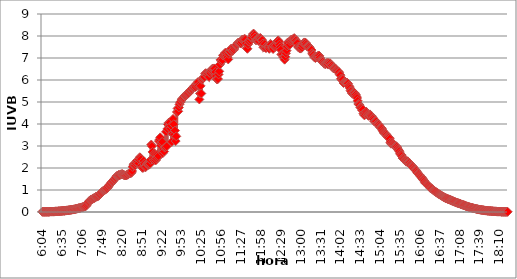
| Category | Series 0 |
|---|---|
| 0.25277777777777777 | 0.009 |
| 0.2534722222222222 | 0.009 |
| 0.25416666666666665 | 0.009 |
| 0.2548611111111111 | 0.009 |
| 0.2555555555555556 | 0.009 |
| 0.25625000000000003 | 0.009 |
| 0.2569444444444445 | 0.009 |
| 0.2576388888888889 | 0.009 |
| 0.25833333333333336 | 0.009 |
| 0.2590277777777778 | 0.009 |
| 0.25972222222222224 | 0.009 |
| 0.2604166666666667 | 0.009 |
| 0.2611111111111111 | 0.019 |
| 0.26180555555555557 | 0.019 |
| 0.2625 | 0.019 |
| 0.26319444444444445 | 0.019 |
| 0.2638888888888889 | 0.019 |
| 0.26458333333333334 | 0.019 |
| 0.2652777777777778 | 0.019 |
| 0.2659722222222222 | 0.019 |
| 0.26666666666666666 | 0.028 |
| 0.2673611111111111 | 0.028 |
| 0.26805555555555555 | 0.028 |
| 0.26875 | 0.028 |
| 0.26944444444444443 | 0.028 |
| 0.2701388888888889 | 0.037 |
| 0.2708333333333333 | 0.037 |
| 0.27152777777777776 | 0.037 |
| 0.2722222222222222 | 0.037 |
| 0.27291666666666664 | 0.047 |
| 0.2736111111111111 | 0.047 |
| 0.2743055555555555 | 0.047 |
| 0.27499999999999997 | 0.056 |
| 0.27569444444444446 | 0.056 |
| 0.27638888888888885 | 0.056 |
| 0.27708333333333335 | 0.056 |
| 0.2777777777777778 | 0.065 |
| 0.27847222222222223 | 0.065 |
| 0.2791666666666667 | 0.075 |
| 0.2798611111111111 | 0.075 |
| 0.28055555555555556 | 0.075 |
| 0.28125 | 0.084 |
| 0.28194444444444444 | 0.084 |
| 0.2826388888888889 | 0.093 |
| 0.2833333333333333 | 0.093 |
| 0.28402777777777777 | 0.103 |
| 0.2847222222222222 | 0.103 |
| 0.28541666666666665 | 0.112 |
| 0.28611111111111115 | 0.112 |
| 0.28680555555555554 | 0.121 |
| 0.28750000000000003 | 0.121 |
| 0.2881944444444445 | 0.13 |
| 0.2888888888888889 | 0.14 |
| 0.28958333333333336 | 0.149 |
| 0.2902777777777778 | 0.149 |
| 0.29097222222222224 | 0.158 |
| 0.2916666666666667 | 0.168 |
| 0.2923611111111111 | 0.177 |
| 0.29305555555555557 | 0.177 |
| 0.29375 | 0.186 |
| 0.29444444444444445 | 0.196 |
| 0.2951388888888889 | 0.205 |
| 0.29583333333333334 | 0.214 |
| 0.2965277777777778 | 0.224 |
| 0.2972222222222222 | 0.233 |
| 0.29791666666666666 | 0.242 |
| 0.2986111111111111 | 0.252 |
| 0.29930555555555555 | 0.261 |
| 0.3 | 0.27 |
| 0.30277777777777776 | 0.308 |
| 0.3055555555555555 | 0.363 |
| 0.30833333333333335 | 0.419 |
| 0.30972222222222223 | 0.447 |
| 0.3111111111111111 | 0.485 |
| 0.3125 | 0.522 |
| 0.31319444444444444 | 0.541 |
| 0.3138888888888889 | 0.559 |
| 0.3145833333333333 | 0.569 |
| 0.31527777777777777 | 0.587 |
| 0.3159722222222222 | 0.606 |
| 0.31666666666666665 | 0.624 |
| 0.31736111111111115 | 0.634 |
| 0.31805555555555554 | 0.652 |
| 0.31875000000000003 | 0.68 |
| 0.3194444444444445 | 0.69 |
| 0.3201388888888889 | 0.699 |
| 0.32083333333333336 | 0.708 |
| 0.3215277777777778 | 0.727 |
| 0.32222222222222224 | 0.746 |
| 0.3229166666666667 | 0.774 |
| 0.3236111111111111 | 0.802 |
| 0.32430555555555557 | 0.839 |
| 0.325 | 0.867 |
| 0.32569444444444445 | 0.904 |
| 0.3263888888888889 | 0.932 |
| 0.32708333333333334 | 0.96 |
| 0.3277777777777778 | 0.979 |
| 0.3284722222222222 | 0.997 |
| 0.32916666666666666 | 1.016 |
| 0.3298611111111111 | 1.044 |
| 0.33055555555555555 | 1.053 |
| 0.33125 | 1.072 |
| 0.33194444444444443 | 1.109 |
| 0.3326388888888889 | 1.156 |
| 0.3333333333333333 | 1.202 |
| 0.3340277777777778 | 1.24 |
| 0.3347222222222222 | 1.268 |
| 0.3354166666666667 | 1.305 |
| 0.3361111111111111 | 1.342 |
| 0.3368055555555556 | 1.379 |
| 0.33749999999999997 | 1.407 |
| 0.33819444444444446 | 1.435 |
| 0.33888888888888885 | 1.473 |
| 0.33958333333333335 | 1.51 |
| 0.34027777777777773 | 1.547 |
| 0.34097222222222223 | 1.584 |
| 0.3416666666666666 | 1.631 |
| 0.3423611111111111 | 1.64 |
| 0.3430555555555555 | 1.659 |
| 0.34375 | 1.687 |
| 0.3444444444444445 | 1.659 |
| 0.3451388888888889 | 1.678 |
| 0.3458333333333334 | 1.706 |
| 0.34652777777777777 | 1.715 |
| 0.34722222222222227 | 1.715 |
| 0.34791666666666665 | 1.724 |
| 0.34861111111111115 | 1.706 |
| 0.34930555555555554 | 1.687 |
| 0.35000000000000003 | 1.668 |
| 0.3506944444444444 | 1.659 |
| 0.3513888888888889 | 1.659 |
| 0.3520833333333333 | 1.668 |
| 0.3527777777777778 | 1.687 |
| 0.3534722222222222 | 1.696 |
| 0.3541666666666667 | 1.734 |
| 0.3548611111111111 | 1.743 |
| 0.35555555555555557 | 1.752 |
| 0.35625 | 1.78 |
| 0.35694444444444445 | 1.761 |
| 0.3576388888888889 | 1.789 |
| 0.35833333333333334 | 1.864 |
| 0.3590277777777778 | 2.05 |
| 0.3597222222222222 | 2.134 |
| 0.36041666666666666 | 2.181 |
| 0.3611111111111111 | 2.2 |
| 0.36180555555555555 | 2.116 |
| 0.3625 | 2.2 |
| 0.36319444444444443 | 2.265 |
| 0.3638888888888889 | 2.339 |
| 0.3645833333333333 | 2.283 |
| 0.3652777777777778 | 2.209 |
| 0.3659722222222222 | 2.386 |
| 0.3666666666666667 | 2.488 |
| 0.3673611111111111 | 2.47 |
| 0.3680555555555556 | 2.405 |
| 0.36874999999999997 | 2.106 |
| 0.36944444444444446 | 2.013 |
| 0.37013888888888885 | 2.004 |
| 0.37083333333333335 | 2.321 |
| 0.37152777777777773 | 2.19 |
| 0.37222222222222223 | 2.06 |
| 0.3729166666666666 | 2.032 |
| 0.3736111111111111 | 2.078 |
| 0.3743055555555555 | 2.2 |
| 0.375 | 2.172 |
| 0.3756944444444445 | 2.153 |
| 0.3763888888888889 | 2.144 |
| 0.3770833333333334 | 2.162 |
| 0.37777777777777777 | 2.2 |
| 0.37847222222222227 | 2.367 |
| 0.37916666666666665 | 3.066 |
| 0.37986111111111115 | 2.992 |
| 0.38055555555555554 | 2.731 |
| 0.38125000000000003 | 2.423 |
| 0.3819444444444444 | 2.349 |
| 0.3826388888888889 | 2.666 |
| 0.3833333333333333 | 2.6 |
| 0.3840277777777778 | 2.349 |
| 0.3847222222222222 | 2.433 |
| 0.3854166666666667 | 2.591 |
| 0.3861111111111111 | 2.479 |
| 0.38680555555555557 | 2.544 |
| 0.3875 | 3.225 |
| 0.38819444444444445 | 3.299 |
| 0.3888888888888889 | 3.392 |
| 0.38958333333333334 | 3.029 |
| 0.3902777777777778 | 3.122 |
| 0.3909722222222222 | 3.187 |
| 0.39166666666666666 | 2.675 |
| 0.3923611111111111 | 2.871 |
| 0.39305555555555555 | 2.749 |
| 0.39375 | 2.926 |
| 0.39444444444444443 | 2.954 |
| 0.3951388888888889 | 3.644 |
| 0.3958333333333333 | 2.982 |
| 0.3965277777777778 | 3.775 |
| 0.3972222222222222 | 3.98 |
| 0.3979166666666667 | 4.054 |
| 0.3986111111111111 | 3.905 |
| 0.3993055555555556 | 4.073 |
| 0.39999999999999997 | 3.793 |
| 0.40069444444444446 | 3.924 |
| 0.40138888888888885 | 3.187 |
| 0.40208333333333335 | 3.551 |
| 0.40277777777777773 | 4.231 |
| 0.40347222222222223 | 3.989 |
| 0.4041666666666666 | 3.523 |
| 0.4048611111111111 | 3.7 |
| 0.4055555555555555 | 3.225 |
| 0.40625 | 3.439 |
| 0.4069444444444445 | 4.548 |
| 0.4076388888888889 | 4.707 |
| 0.4083333333333334 | 4.576 |
| 0.40902777777777777 | 4.753 |
| 0.40972222222222227 | 4.893 |
| 0.41041666666666665 | 4.986 |
| 0.41111111111111115 | 5.005 |
| 0.41180555555555554 | 5.089 |
| 0.41250000000000003 | 5.135 |
| 0.4131944444444444 | 5.163 |
| 0.4138888888888889 | 5.173 |
| 0.4145833333333333 | 5.219 |
| 0.4152777777777778 | 5.266 |
| 0.4159722222222222 | 5.284 |
| 0.4173611111111111 | 5.322 |
| 0.41805555555555557 | 5.34 |
| 0.41875 | 5.368 |
| 0.41944444444444445 | 5.415 |
| 0.4201388888888889 | 5.396 |
| 0.42083333333333334 | 5.452 |
| 0.4215277777777778 | 5.499 |
| 0.4222222222222222 | 5.517 |
| 0.42291666666666666 | 5.555 |
| 0.4236111111111111 | 5.583 |
| 0.42430555555555555 | 5.62 |
| 0.425 | 5.657 |
| 0.42569444444444443 | 5.685 |
| 0.4263888888888889 | 5.722 |
| 0.4270833333333333 | 5.741 |
| 0.4277777777777778 | 5.685 |
| 0.4284722222222222 | 5.769 |
| 0.4291666666666667 | 5.844 |
| 0.4298611111111111 | 5.862 |
| 0.4305555555555556 | 5.909 |
| 0.43124999999999997 | 5.75 |
| 0.43194444444444446 | 5.117 |
| 0.43263888888888885 | 5.387 |
| 0.43333333333333335 | 5.732 |
| 0.43402777777777773 | 5.387 |
| 0.43472222222222223 | 6.011 |
| 0.4354166666666666 | 6.049 |
| 0.4361111111111111 | 6.095 |
| 0.4368055555555555 | 6.133 |
| 0.4375 | 6.142 |
| 0.4381944444444445 | 6.282 |
| 0.4388888888888889 | 6.31 |
| 0.4395833333333334 | 6.291 |
| 0.44027777777777777 | 6.216 |
| 0.44097222222222227 | 6.291 |
| 0.44166666666666665 | 6.291 |
| 0.44236111111111115 | 6.142 |
| 0.44305555555555554 | 6.328 |
| 0.44375000000000003 | 6.319 |
| 0.4444444444444444 | 6.412 |
| 0.4451388888888889 | 6.459 |
| 0.4458333333333333 | 6.505 |
| 0.4465277777777778 | 6.505 |
| 0.4472222222222222 | 6.524 |
| 0.4479166666666667 | 6.524 |
| 0.4486111111111111 | 6.524 |
| 0.44930555555555557 | 6.366 |
| 0.45 | 6.179 |
| 0.45069444444444445 | 6.039 |
| 0.4513888888888889 | 6.03 |
| 0.45208333333333334 | 6.049 |
| 0.4527777777777778 | 6.254 |
| 0.4534722222222222 | 6.394 |
| 0.45416666666666666 | 6.701 |
| 0.4548611111111111 | 6.915 |
| 0.45555555555555555 | 6.925 |
| 0.45625 | 6.841 |
| 0.45694444444444443 | 6.906 |
| 0.4576388888888889 | 7.111 |
| 0.4583333333333333 | 7.148 |
| 0.4590277777777778 | 7.167 |
| 0.4597222222222222 | 7.223 |
| 0.4604166666666667 | 7.242 |
| 0.4611111111111111 | 7.186 |
| 0.4618055555555556 | 7.12 |
| 0.46249999999999997 | 7.037 |
| 0.46319444444444446 | 6.934 |
| 0.46388888888888885 | 7.186 |
| 0.46458333333333335 | 7.279 |
| 0.46527777777777773 | 7.288 |
| 0.46597222222222223 | 7.409 |
| 0.4666666666666666 | 7.419 |
| 0.4673611111111111 | 7.326 |
| 0.4680555555555555 | 7.326 |
| 0.46875 | 7.353 |
| 0.4694444444444445 | 7.391 |
| 0.4701388888888889 | 7.465 |
| 0.4708333333333334 | 7.531 |
| 0.47152777777777777 | 7.577 |
| 0.47222222222222227 | 7.596 |
| 0.47291666666666665 | 7.624 |
| 0.47361111111111115 | 7.68 |
| 0.47430555555555554 | 7.698 |
| 0.47500000000000003 | 7.698 |
| 0.4756944444444444 | 7.698 |
| 0.4763888888888889 | 7.689 |
| 0.4770833333333333 | 7.661 |
| 0.4777777777777778 | 7.726 |
| 0.4784722222222222 | 7.838 |
| 0.4791666666666667 | 7.81 |
| 0.4798611111111111 | 7.838 |
| 0.48055555555555557 | 7.857 |
| 0.48125 | 7.866 |
| 0.48194444444444445 | 7.838 |
| 0.4826388888888889 | 7.67 |
| 0.48333333333333334 | 7.447 |
| 0.4840277777777778 | 7.419 |
| 0.4847222222222222 | 7.624 |
| 0.48541666666666666 | 7.745 |
| 0.4861111111111111 | 7.745 |
| 0.48680555555555555 | 7.838 |
| 0.4875 | 7.801 |
| 0.48819444444444443 | 7.913 |
| 0.4888888888888889 | 7.922 |
| 0.4895833333333333 | 8.034 |
| 0.4902777777777778 | 8.099 |
| 0.4909722222222222 | 8.099 |
| 0.4916666666666667 | 8.043 |
| 0.4923611111111111 | 7.931 |
| 0.4930555555555556 | 7.81 |
| 0.49374999999999997 | 7.819 |
| 0.49444444444444446 | 7.829 |
| 0.49513888888888885 | 7.866 |
| 0.49583333333333335 | 7.847 |
| 0.49652777777777773 | 7.764 |
| 0.49722222222222223 | 7.875 |
| 0.4979166666666666 | 7.913 |
| 0.4986111111111111 | 7.866 |
| 0.4993055555555555 | 7.819 |
| 0.5 | 7.81 |
| 0.5006944444444444 | 7.661 |
| 0.5013888888888889 | 7.484 |
| 0.5020833333333333 | 7.512 |
| 0.5027777777777778 | 7.633 |
| 0.5034722222222222 | 7.484 |
| 0.5041666666666667 | 7.447 |
| 0.5048611111111111 | 7.549 |
| 0.5055555555555555 | 7.493 |
| 0.50625 | 7.531 |
| 0.5069444444444444 | 7.503 |
| 0.5076388888888889 | 7.419 |
| 0.5083333333333333 | 7.503 |
| 0.5090277777777777 | 7.642 |
| 0.5097222222222222 | 7.614 |
| 0.5104166666666666 | 7.493 |
| 0.5111111111111112 | 7.503 |
| 0.5118055555555555 | 7.409 |
| 0.5125000000000001 | 7.549 |
| 0.5131944444444444 | 7.568 |
| 0.513888888888889 | 7.503 |
| 0.5145833333333333 | 7.521 |
| 0.5152777777777778 | 7.577 |
| 0.5159722222222222 | 7.736 |
| 0.5166666666666667 | 7.773 |
| 0.517361111111111 | 7.801 |
| 0.5180555555555556 | 7.745 |
| 0.5187499999999999 | 7.605 |
| 0.5194444444444445 | 7.484 |
| 0.5201388888888888 | 7.372 |
| 0.5208333333333334 | 7.158 |
| 0.5215277777777778 | 7.176 |
| 0.5222222222222223 | 7.167 |
| 0.5229166666666667 | 7.037 |
| 0.5236111111111111 | 7.037 |
| 0.5243055555555556 | 6.925 |
| 0.525 | 7.055 |
| 0.5256944444444445 | 7.214 |
| 0.5263888888888889 | 7.335 |
| 0.5270833333333333 | 7.531 |
| 0.5277777777777778 | 7.708 |
| 0.5284722222222222 | 7.661 |
| 0.5291666666666667 | 7.568 |
| 0.5298611111111111 | 7.605 |
| 0.5305555555555556 | 7.754 |
| 0.53125 | 7.819 |
| 0.5319444444444444 | 7.838 |
| 0.5326388888888889 | 7.801 |
| 0.5333333333333333 | 7.857 |
| 0.5340277777777778 | 7.847 |
| 0.5347222222222222 | 7.903 |
| 0.5354166666666667 | 7.857 |
| 0.5361111111111111 | 7.801 |
| 0.5368055555555555 | 7.801 |
| 0.5375 | 7.717 |
| 0.5381944444444444 | 7.67 |
| 0.5388888888888889 | 7.512 |
| 0.5395833333333333 | 7.475 |
| 0.5402777777777777 | 7.456 |
| 0.5409722222222222 | 7.437 |
| 0.5416666666666666 | 7.428 |
| 0.5423611111111112 | 7.484 |
| 0.5430555555555555 | 7.465 |
| 0.5437500000000001 | 7.568 |
| 0.5444444444444444 | 7.67 |
| 0.545138888888889 | 7.68 |
| 0.5458333333333333 | 7.708 |
| 0.5465277777777778 | 7.698 |
| 0.5472222222222222 | 7.689 |
| 0.5479166666666667 | 7.624 |
| 0.548611111111111 | 7.54 |
| 0.5493055555555556 | 7.512 |
| 0.5499999999999999 | 7.531 |
| 0.5506944444444445 | 7.521 |
| 0.5513888888888888 | 7.475 |
| 0.5520833333333334 | 7.409 |
| 0.5527777777777778 | 7.391 |
| 0.5534722222222223 | 7.363 |
| 0.5541666666666667 | 7.223 |
| 0.5548611111111111 | 7.167 |
| 0.5555555555555556 | 7.13 |
| 0.55625 | 7.046 |
| 0.5569444444444445 | 7.046 |
| 0.5576388888888889 | 6.999 |
| 0.5583333333333333 | 7.046 |
| 0.5590277777777778 | 7.046 |
| 0.5597222222222222 | 7.046 |
| 0.5604166666666667 | 7.093 |
| 0.5611111111111111 | 7.111 |
| 0.5618055555555556 | 7.102 |
| 0.5625 | 7.018 |
| 0.5631944444444444 | 6.925 |
| 0.5638888888888889 | 6.878 |
| 0.5645833333333333 | 6.878 |
| 0.5652777777777778 | 6.85 |
| 0.5659722222222222 | 6.841 |
| 0.5666666666666667 | 6.785 |
| 0.5673611111111111 | 6.738 |
| 0.5680555555555555 | 6.738 |
| 0.56875 | 6.72 |
| 0.5694444444444444 | 6.748 |
| 0.5701388888888889 | 6.776 |
| 0.5708333333333333 | 6.766 |
| 0.5715277777777777 | 6.701 |
| 0.5722222222222222 | 6.776 |
| 0.5729166666666666 | 6.738 |
| 0.5736111111111112 | 6.757 |
| 0.5743055555555555 | 6.682 |
| 0.5750000000000001 | 6.654 |
| 0.5756944444444444 | 6.664 |
| 0.576388888888889 | 6.589 |
| 0.5770833333333333 | 6.533 |
| 0.5777777777777778 | 6.533 |
| 0.5784722222222222 | 6.543 |
| 0.5791666666666667 | 6.524 |
| 0.579861111111111 | 6.487 |
| 0.5805555555555556 | 6.449 |
| 0.5812499999999999 | 6.421 |
| 0.5819444444444445 | 6.403 |
| 0.5826388888888888 | 6.347 |
| 0.5833333333333334 | 6.356 |
| 0.5840277777777778 | 6.254 |
| 0.5847222222222223 | 6.216 |
| 0.5854166666666667 | 6.058 |
| 0.5861111111111111 | 6.011 |
| 0.5868055555555556 | 6.049 |
| 0.5875 | 6.011 |
| 0.5881944444444445 | 5.862 |
| 0.5888888888888889 | 5.909 |
| 0.5895833333333333 | 5.909 |
| 0.5902777777777778 | 5.9 |
| 0.5909722222222222 | 5.881 |
| 0.5916666666666667 | 5.881 |
| 0.5923611111111111 | 5.862 |
| 0.5930555555555556 | 5.834 |
| 0.59375 | 5.741 |
| 0.5944444444444444 | 5.695 |
| 0.5951388888888889 | 5.629 |
| 0.5958333333333333 | 5.527 |
| 0.5965277777777778 | 5.48 |
| 0.5972222222222222 | 5.406 |
| 0.5979166666666667 | 5.378 |
| 0.5986111111111111 | 5.387 |
| 0.5993055555555555 | 5.434 |
| 0.6 | 5.415 |
| 0.6006944444444444 | 5.359 |
| 0.6013888888888889 | 5.331 |
| 0.6020833333333333 | 5.256 |
| 0.6027777777777777 | 5.182 |
| 0.6034722222222222 | 5.051 |
| 0.6041666666666666 | 4.912 |
| 0.6048611111111112 | 4.893 |
| 0.6055555555555555 | 4.856 |
| 0.6062500000000001 | 4.763 |
| 0.6069444444444444 | 4.753 |
| 0.607638888888889 | 4.707 |
| 0.6083333333333333 | 4.623 |
| 0.6090277777777778 | 4.66 |
| 0.6097222222222222 | 4.474 |
| 0.6104166666666667 | 4.408 |
| 0.611111111111111 | 4.408 |
| 0.6118055555555556 | 4.464 |
| 0.6124999999999999 | 4.567 |
| 0.6131944444444445 | 4.53 |
| 0.6138888888888888 | 4.464 |
| 0.6145833333333334 | 4.418 |
| 0.6152777777777778 | 4.371 |
| 0.6159722222222223 | 4.408 |
| 0.6166666666666667 | 4.436 |
| 0.6173611111111111 | 4.399 |
| 0.6180555555555556 | 4.38 |
| 0.61875 | 4.352 |
| 0.6194444444444445 | 4.287 |
| 0.6201388888888889 | 4.259 |
| 0.6208333333333333 | 4.203 |
| 0.6215277777777778 | 4.119 |
| 0.6222222222222222 | 4.129 |
| 0.6229166666666667 | 4.129 |
| 0.6236111111111111 | 4.11 |
| 0.6243055555555556 | 4.017 |
| 0.625 | 3.98 |
| 0.6256944444444444 | 3.98 |
| 0.6263888888888889 | 3.961 |
| 0.6270833333333333 | 3.914 |
| 0.6277777777777778 | 3.858 |
| 0.6284722222222222 | 3.831 |
| 0.6291666666666667 | 3.821 |
| 0.6298611111111111 | 3.775 |
| 0.6305555555555555 | 3.7 |
| 0.63125 | 3.644 |
| 0.6319444444444444 | 3.598 |
| 0.6326388888888889 | 3.57 |
| 0.6333333333333333 | 3.551 |
| 0.6340277777777777 | 3.542 |
| 0.6347222222222222 | 3.504 |
| 0.6354166666666666 | 3.448 |
| 0.6361111111111112 | 3.411 |
| 0.6368055555555555 | 3.383 |
| 0.6375000000000001 | 3.383 |
| 0.6381944444444444 | 3.327 |
| 0.638888888888889 | 3.169 |
| 0.6395833333333333 | 3.104 |
| 0.6402777777777778 | 3.122 |
| 0.6409722222222222 | 3.15 |
| 0.6416666666666667 | 3.094 |
| 0.642361111111111 | 3.076 |
| 0.6430555555555556 | 3.048 |
| 0.6437499999999999 | 2.992 |
| 0.6444444444444445 | 3.001 |
| 0.6451388888888888 | 2.992 |
| 0.6458333333333334 | 2.964 |
| 0.6465277777777778 | 2.908 |
| 0.6472222222222223 | 2.852 |
| 0.6479166666666667 | 2.805 |
| 0.6486111111111111 | 2.759 |
| 0.6493055555555556 | 2.675 |
| 0.65 | 2.61 |
| 0.6506944444444445 | 2.6 |
| 0.6513888888888889 | 2.544 |
| 0.6520833333333333 | 2.451 |
| 0.6527777777777778 | 2.423 |
| 0.6534722222222222 | 2.414 |
| 0.6541666666666667 | 2.377 |
| 0.6548611111111111 | 2.339 |
| 0.6555555555555556 | 2.311 |
| 0.65625 | 2.283 |
| 0.6569444444444444 | 2.311 |
| 0.6576388888888889 | 2.302 |
| 0.6583333333333333 | 2.265 |
| 0.6590277777777778 | 2.246 |
| 0.6597222222222222 | 2.218 |
| 0.6604166666666667 | 2.172 |
| 0.6611111111111111 | 2.134 |
| 0.6618055555555555 | 2.106 |
| 0.6625 | 2.078 |
| 0.6631944444444444 | 2.05 |
| 0.6638888888888889 | 2.022 |
| 0.6645833333333333 | 1.976 |
| 0.6652777777777777 | 1.939 |
| 0.6659722222222222 | 1.911 |
| 0.6666666666666666 | 1.892 |
| 0.6673611111111111 | 1.855 |
| 0.6680555555555556 | 1.799 |
| 0.6687500000000001 | 1.752 |
| 0.6694444444444444 | 1.724 |
| 0.6701388888888888 | 1.696 |
| 0.6708333333333334 | 1.668 |
| 0.6715277777777778 | 1.622 |
| 0.6722222222222222 | 1.603 |
| 0.6729166666666666 | 1.566 |
| 0.6736111111111112 | 1.519 |
| 0.6743055555555556 | 1.482 |
| 0.6749999999999999 | 1.445 |
| 0.6756944444444444 | 1.407 |
| 0.6763888888888889 | 1.351 |
| 0.6770833333333334 | 1.305 |
| 0.6777777777777777 | 1.286 |
| 0.6784722222222223 | 1.258 |
| 0.6791666666666667 | 1.24 |
| 0.6798611111111111 | 1.202 |
| 0.6805555555555555 | 1.174 |
| 0.68125 | 1.146 |
| 0.6819444444444445 | 1.1 |
| 0.6826388888888889 | 1.081 |
| 0.6833333333333332 | 1.072 |
| 0.6840277777777778 | 1.053 |
| 0.6847222222222222 | 1.025 |
| 0.6854166666666667 | 0.988 |
| 0.686111111111111 | 0.969 |
| 0.6868055555555556 | 0.951 |
| 0.6875 | 0.932 |
| 0.6881944444444444 | 0.913 |
| 0.688888888888889 | 0.885 |
| 0.6895833333333333 | 0.867 |
| 0.6902777777777778 | 0.848 |
| 0.6909722222222222 | 0.829 |
| 0.6916666666666668 | 0.811 |
| 0.6923611111111111 | 0.792 |
| 0.6930555555555555 | 0.774 |
| 0.69375 | 0.755 |
| 0.6944444444444445 | 0.736 |
| 0.6951388888888889 | 0.718 |
| 0.6958333333333333 | 0.699 |
| 0.6965277777777777 | 0.68 |
| 0.6972222222222223 | 0.671 |
| 0.6979166666666666 | 0.652 |
| 0.6986111111111111 | 0.634 |
| 0.6993055555555556 | 0.624 |
| 0.7000000000000001 | 0.615 |
| 0.7006944444444444 | 0.596 |
| 0.7013888888888888 | 0.587 |
| 0.7020833333333334 | 0.578 |
| 0.7027777777777778 | 0.569 |
| 0.7034722222222222 | 0.55 |
| 0.7041666666666666 | 0.541 |
| 0.7048611111111112 | 0.531 |
| 0.7055555555555556 | 0.513 |
| 0.7062499999999999 | 0.503 |
| 0.7069444444444444 | 0.494 |
| 0.7076388888888889 | 0.475 |
| 0.7083333333333334 | 0.466 |
| 0.7090277777777777 | 0.457 |
| 0.7097222222222223 | 0.438 |
| 0.7104166666666667 | 0.429 |
| 0.7111111111111111 | 0.419 |
| 0.7118055555555555 | 0.41 |
| 0.7125 | 0.401 |
| 0.7131944444444445 | 0.391 |
| 0.7138888888888889 | 0.382 |
| 0.7145833333333332 | 0.373 |
| 0.7152777777777778 | 0.354 |
| 0.7159722222222222 | 0.345 |
| 0.7166666666666667 | 0.336 |
| 0.717361111111111 | 0.326 |
| 0.7180555555555556 | 0.317 |
| 0.71875 | 0.308 |
| 0.7194444444444444 | 0.298 |
| 0.720138888888889 | 0.28 |
| 0.7208333333333333 | 0.27 |
| 0.7215277777777778 | 0.261 |
| 0.7222222222222222 | 0.252 |
| 0.7229166666666668 | 0.242 |
| 0.7236111111111111 | 0.233 |
| 0.7243055555555555 | 0.224 |
| 0.725 | 0.214 |
| 0.7256944444444445 | 0.205 |
| 0.7263888888888889 | 0.196 |
| 0.7270833333333333 | 0.196 |
| 0.7277777777777777 | 0.186 |
| 0.7284722222222223 | 0.177 |
| 0.7291666666666666 | 0.168 |
| 0.7298611111111111 | 0.158 |
| 0.7305555555555556 | 0.158 |
| 0.7312500000000001 | 0.149 |
| 0.7319444444444444 | 0.14 |
| 0.7326388888888888 | 0.13 |
| 0.7333333333333334 | 0.13 |
| 0.7340277777777778 | 0.121 |
| 0.7347222222222222 | 0.112 |
| 0.7354166666666666 | 0.112 |
| 0.7361111111111112 | 0.103 |
| 0.7368055555555556 | 0.103 |
| 0.7374999999999999 | 0.093 |
| 0.7381944444444444 | 0.093 |
| 0.7388888888888889 | 0.084 |
| 0.7395833333333334 | 0.084 |
| 0.7402777777777777 | 0.075 |
| 0.7409722222222223 | 0.075 |
| 0.7416666666666667 | 0.065 |
| 0.7423611111111111 | 0.065 |
| 0.7430555555555555 | 0.065 |
| 0.74375 | 0.056 |
| 0.7444444444444445 | 0.056 |
| 0.7451388888888889 | 0.056 |
| 0.7458333333333332 | 0.047 |
| 0.7465277777777778 | 0.047 |
| 0.7472222222222222 | 0.047 |
| 0.7479166666666667 | 0.047 |
| 0.748611111111111 | 0.037 |
| 0.7493055555555556 | 0.037 |
| 0.75 | 0.037 |
| 0.7506944444444444 | 0.028 |
| 0.751388888888889 | 0.028 |
| 0.7520833333333333 | 0.028 |
| 0.7527777777777778 | 0.028 |
| 0.7534722222222222 | 0.028 |
| 0.7541666666666668 | 0.019 |
| 0.7548611111111111 | 0.019 |
| 0.7555555555555555 | 0.019 |
| 0.75625 | 0.019 |
| 0.7569444444444445 | 0.019 |
| 0.7576388888888889 | 0.019 |
| 0.7583333333333333 | 0.019 |
| 0.7590277777777777 | 0.009 |
| 0.7597222222222223 | 0.009 |
| 0.7604166666666666 | 0.009 |
| 0.7611111111111111 | 0.009 |
| 0.7618055555555556 | 0.009 |
| 0.7625000000000001 | 0.009 |
| 0.7631944444444444 | 0.009 |
| 0.7638888888888888 | 0.009 |
| 0.7645833333333334 | 0.009 |
| 0.7652777777777778 | 0.009 |
| 0.7659722222222222 | 0.009 |